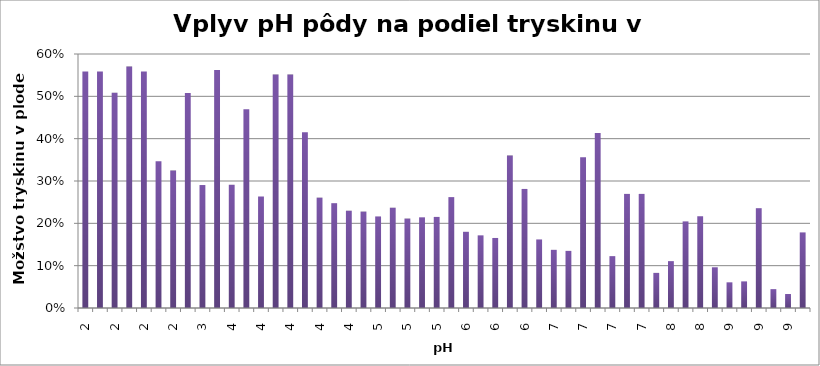
| Category | Series 0 |
|---|---|
| 2.01 | 0.559 |
| 2.01 | 0.559 |
| 2.07 | 0.509 |
| 2.16 | 0.57 |
| 2.26 | 0.559 |
| 2.38 | 0.347 |
| 2.43 | 0.325 |
| 2.55 | 0.508 |
| 3.18 | 0.29 |
| 3.29 | 0.562 |
| 3.64 | 0.291 |
| 3.9 | 0.469 |
| 4.05 | 0.263 |
| 4.11 | 0.551 |
| 4.11 | 0.551 |
| 4.3 | 0.415 |
| 4.34 | 0.261 |
| 4.39 | 0.248 |
| 4.43 | 0.23 |
| 4.48 | 0.228 |
| 4.79 | 0.216 |
| 4.84 | 0.237 |
| 4.88 | 0.211 |
| 4.89 | 0.214 |
| 5.2 | 0.215 |
| 5.758000000000002 | 0.262 |
| 5.81 | 0.18 |
| 5.84 | 0.172 |
| 6.17 | 0.165 |
| 6.28 | 0.36 |
| 6.39 | 0.281 |
| 6.55 | 0.162 |
| 6.67 | 0.137 |
| 6.73 | 0.135 |
| 6.79 | 0.356 |
| 6.86 | 0.414 |
| 7.03 | 0.123 |
| 7.12 | 0.27 |
| 7.12 | 0.27 |
| 7.99 | 0.083 |
| 8.05 | 0.111 |
| 8.08 | 0.205 |
| 8.26 | 0.217 |
| 8.37 | 0.096 |
| 8.53 | 0.061 |
| 8.71 | 0.063 |
| 8.8 | 0.236 |
| 8.92 | 0.045 |
| 9.2 | 0.033 |
| 9.39 | 0.179 |